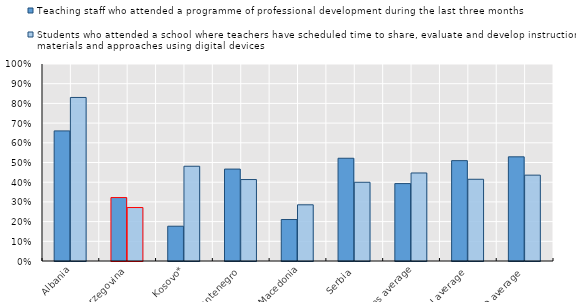
| Category | Teaching staff who attended a programme of professional development during the last three months | Students who attended a school where teachers have scheduled time to share, evaluate and develop instructional materials and approaches using digital devices |
|---|---|---|
| Albania | 0.66 | 0.83 |
| Bosnia and Herzegovina | 0.322 | 0.271 |
| Kosovo* | 0.177 | 0.481 |
| Montenegro | 0.467 | 0.414 |
| North Macedonia | 0.211 | 0.285 |
| Serbia | 0.522 | 0.4 |
| Western Balkans average | 0.393 | 0.447 |
| EU average | 0.509 | 0.415 |
| OECD average | 0.529 | 0.436 |